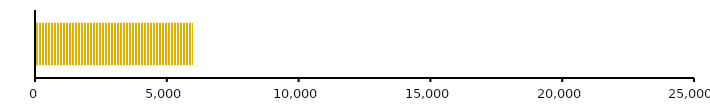
| Category | TOTAL DE PASSIVOS | TOTAL DE ATIVOS |
|---|---|---|
| 0 | 5952 | 23216 |